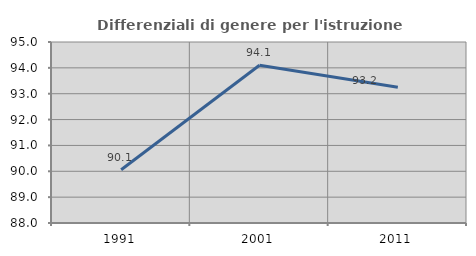
| Category | Differenziali di genere per l'istruzione superiore |
|---|---|
| 1991.0 | 90.058 |
| 2001.0 | 94.102 |
| 2011.0 | 93.249 |